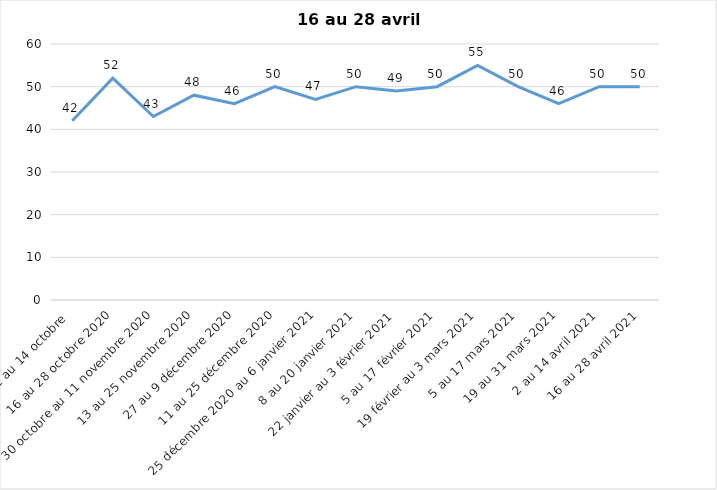
| Category | Toujours aux trois mesures |
|---|---|
| 2 au 14 octobre  | 42 |
| 16 au 28 octobre 2020 | 52 |
| 30 octobre au 11 novembre 2020 | 43 |
| 13 au 25 novembre 2020 | 48 |
| 27 au 9 décembre 2020 | 46 |
| 11 au 25 décembre 2020 | 50 |
| 25 décembre 2020 au 6 janvier 2021 | 47 |
| 8 au 20 janvier 2021 | 50 |
| 22 janvier au 3 février 2021 | 49 |
| 5 au 17 février 2021 | 50 |
| 19 février au 3 mars 2021 | 55 |
| 5 au 17 mars 2021 | 50 |
| 19 au 31 mars 2021 | 46 |
| 2 au 14 avril 2021 | 50 |
| 16 au 28 avril 2021 | 50 |